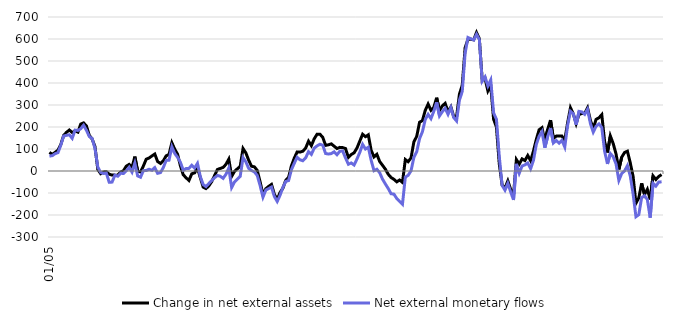
| Category | Change in net external assets | Net external monetary flows |
|---|---|---|
| 2005-01-01 | 84.602 | 67.742 |
| 2005-02-01 | 75.768 | 69.754 |
| 2005-03-01 | 84.565 | 78.479 |
| 2005-04-01 | 94.867 | 83.466 |
| 2005-05-01 | 120.796 | 117.752 |
| 2005-06-01 | 161.661 | 159.083 |
| 2005-07-01 | 175.894 | 162.193 |
| 2005-08-01 | 186.284 | 164.691 |
| 2005-09-01 | 175.003 | 148.417 |
| 2005-10-01 | 182.174 | 185.904 |
| 2005-11-01 | 176.606 | 184.289 |
| 2005-12-01 | 213.319 | 192.242 |
| 2006-01-01 | 218.733 | 207.939 |
| 2006-02-01 | 204.528 | 185.08 |
| 2006-03-01 | 162.228 | 156.78 |
| 2006-04-01 | 145.362 | 147.754 |
| 2006-05-01 | 111.135 | 102.606 |
| 2006-06-01 | 6.662 | 17.415 |
| 2006-07-01 | -12.166 | -6.296 |
| 2006-08-01 | -4.168 | -11.297 |
| 2006-09-01 | -3.265 | -9.8 |
| 2006-10-01 | -14.718 | -51.337 |
| 2006-11-01 | -18.699 | -50.437 |
| 2006-12-01 | -18.761 | -18.99 |
| 2007-01-01 | -18.794 | -23.779 |
| 2007-02-01 | -4.785 | -10.331 |
| 2007-03-01 | 1.322 | -11.333 |
| 2007-04-01 | 21.973 | 1.001 |
| 2007-05-01 | 29.944 | 17.265 |
| 2007-06-01 | 15.49 | -4.947 |
| 2007-07-01 | 65.435 | 35.61 |
| 2007-08-01 | -1.17 | -22.329 |
| 2007-09-01 | -4.492 | -28.356 |
| 2007-10-01 | 22.832 | 1.507 |
| 2007-11-01 | 53.698 | 2.105 |
| 2007-12-01 | 59.105 | 8.073 |
| 2008-01-01 | 68.422 | 3.251 |
| 2008-02-01 | 77.146 | 15.499 |
| 2008-03-01 | 43.111 | -10.56 |
| 2008-04-01 | 34.295 | -7.237 |
| 2008-05-01 | 46.499 | 15.561 |
| 2008-06-01 | 68.778 | 47.865 |
| 2008-07-01 | 75.541 | 49.158 |
| 2008-08-01 | 128.455 | 109.871 |
| 2008-09-01 | 99.379 | 80.045 |
| 2008-10-01 | 76.425 | 62.419 |
| 2008-11-01 | 23.697 | 39.814 |
| 2008-12-01 | -17.238 | 3.439 |
| 2009-01-01 | -30.81 | 11.219 |
| 2009-02-01 | -42.978 | 11.866 |
| 2009-03-01 | -12.659 | 26.365 |
| 2009-04-01 | -8.258 | 13.341 |
| 2009-05-01 | 13.629 | 34.681 |
| 2009-06-01 | -30.493 | -26.083 |
| 2009-07-01 | -73.165 | -61.587 |
| 2009-08-01 | -79.753 | -70.972 |
| 2009-09-01 | -67.73 | -56.797 |
| 2009-10-01 | -48.338 | -43.667 |
| 2009-11-01 | -20.878 | -30.458 |
| 2009-12-01 | 6.985 | -20.283 |
| 2010-01-01 | 11.571 | -23.811 |
| 2010-02-01 | 16.327 | -33.36 |
| 2010-03-01 | 30.202 | -14.966 |
| 2010-04-01 | 53.937 | 13.234 |
| 2010-05-01 | -24.51 | -75.025 |
| 2010-06-01 | -1.701 | -49.614 |
| 2010-07-01 | 9.895 | -36.86 |
| 2010-08-01 | 20.827 | -24.786 |
| 2010-09-01 | 102.244 | 61.041 |
| 2010-10-01 | 82.07 | 41.544 |
| 2010-11-01 | 48.49 | 11.583 |
| 2010-12-01 | 21.595 | 2.158 |
| 2011-01-01 | 18.876 | -4.419 |
| 2011-02-01 | 2.622 | -20.317 |
| 2011-03-01 | -49.304 | -66.419 |
| 2011-04-01 | -106.947 | -118.835 |
| 2011-05-01 | -80.67 | -86.757 |
| 2011-06-01 | -70.021 | -79.882 |
| 2011-07-01 | -60.962 | -72.934 |
| 2011-08-01 | -105.797 | -115.817 |
| 2011-09-01 | -129.501 | -138.462 |
| 2011-10-01 | -97.518 | -110.581 |
| 2011-11-01 | -78.197 | -74.537 |
| 2011-12-01 | -42.679 | -47.53 |
| 2012-01-01 | -29.112 | -43.465 |
| 2012-02-01 | 23.815 | 6.03 |
| 2012-03-01 | 58.542 | 35.278 |
| 2012-04-01 | 86.743 | 62.241 |
| 2012-05-01 | 85.993 | 50.944 |
| 2012-06-01 | 89.745 | 46.452 |
| 2012-07-01 | 104.245 | 59.744 |
| 2012-08-01 | 135.46 | 87.982 |
| 2012-09-01 | 115.213 | 75.569 |
| 2012-10-01 | 146.331 | 103.813 |
| 2012-11-01 | 167.246 | 114.222 |
| 2012-12-01 | 167.414 | 121.586 |
| 2013-01-01 | 152.876 | 116.925 |
| 2013-02-01 | 116.592 | 79.382 |
| 2013-03-01 | 119.069 | 77.228 |
| 2013-04-01 | 123.293 | 79.122 |
| 2013-05-01 | 112.653 | 87.399 |
| 2013-06-01 | 102.163 | 74.155 |
| 2013-07-01 | 107.454 | 90.001 |
| 2013-08-01 | 106.465 | 90.765 |
| 2013-09-01 | 101.981 | 59.142 |
| 2013-10-01 | 62.14 | 30.708 |
| 2013-11-01 | 74.663 | 36.578 |
| 2013-12-01 | 82.718 | 27.217 |
| 2014-01-01 | 103.873 | 53.978 |
| 2014-02-01 | 135.496 | 84.209 |
| 2014-03-01 | 167.072 | 121.102 |
| 2014-04-01 | 155.977 | 99.954 |
| 2014-05-01 | 164.473 | 107.861 |
| 2014-06-01 | 93.904 | 48.556 |
| 2014-07-01 | 64.113 | 1.586 |
| 2014-08-01 | 76.026 | 8.12 |
| 2014-09-01 | 42.969 | -8.053 |
| 2014-10-01 | 26.059 | -37.31 |
| 2014-11-01 | 8.059 | -59.117 |
| 2014-12-01 | -15.012 | -79.702 |
| 2015-01-01 | -29.624 | -103.37 |
| 2015-02-01 | -37.976 | -105.142 |
| 2015-03-01 | -49.245 | -125.194 |
| 2015-04-01 | -40.93 | -138.682 |
| 2015-05-01 | -52.006 | -151.08 |
| 2015-06-01 | 52.138 | -27.916 |
| 2015-07-01 | 42.19 | -19.548 |
| 2015-08-01 | 59.355 | 0.616 |
| 2015-09-01 | 132.123 | 61.715 |
| 2015-10-01 | 157.496 | 87.238 |
| 2015-11-01 | 221.645 | 147.184 |
| 2015-12-01 | 229.134 | 178.373 |
| 2016-01-01 | 275.633 | 233.851 |
| 2016-02-01 | 304.065 | 257.324 |
| 2016-03-01 | 275.872 | 238.001 |
| 2016-04-01 | 289.172 | 271.333 |
| 2016-05-01 | 333.132 | 312.25 |
| 2016-06-01 | 275.061 | 250.304 |
| 2016-07-01 | 296.226 | 269.814 |
| 2016-08-01 | 307.569 | 285.273 |
| 2016-09-01 | 269.195 | 257.496 |
| 2016-10-01 | 291.1 | 288.182 |
| 2016-11-01 | 247.737 | 242.725 |
| 2016-12-01 | 247.105 | 227.438 |
| 2017-01-01 | 348.817 | 322.292 |
| 2017-02-01 | 390.415 | 361.713 |
| 2017-03-01 | 560.135 | 535.461 |
| 2017-04-01 | 598.344 | 606.82 |
| 2017-05-01 | 598.977 | 600.858 |
| 2017-06-01 | 596.166 | 595.57 |
| 2017-07-01 | 629.416 | 621.638 |
| 2017-08-01 | 601.233 | 597.149 |
| 2017-09-01 | 412.849 | 407.873 |
| 2017-10-01 | 421.367 | 427.586 |
| 2017-11-01 | 363.582 | 386.555 |
| 2017-12-01 | 387.305 | 413.92 |
| 2018-01-01 | 235.716 | 264.296 |
| 2018-02-01 | 199.669 | 235.147 |
| 2018-03-01 | 31.722 | 65.964 |
| 2018-04-01 | -64.367 | -65.71 |
| 2018-05-01 | -77.832 | -87.233 |
| 2018-06-01 | -44.903 | -56.038 |
| 2018-07-01 | -84.093 | -95.425 |
| 2018-08-01 | -110.026 | -130.751 |
| 2018-09-01 | 51.922 | 32.057 |
| 2018-10-01 | 31.137 | -10.283 |
| 2018-11-01 | 55.059 | 22.546 |
| 2018-12-01 | 47.389 | 27.782 |
| 2019-01-01 | 70.498 | 36.35 |
| 2019-02-01 | 46.698 | 10.372 |
| 2019-03-01 | 90.65 | 48.02 |
| 2019-04-01 | 143.34 | 120.878 |
| 2019-05-01 | 187.409 | 158.262 |
| 2019-06-01 | 196.861 | 178.914 |
| 2019-07-01 | 135.278 | 105.694 |
| 2019-08-01 | 189.124 | 156.059 |
| 2019-09-01 | 231.431 | 195.16 |
| 2019-10-01 | 147.791 | 127.403 |
| 2019-11-01 | 158.529 | 138.611 |
| 2019-12-01 | 158.633 | 126.739 |
| 2020-01-01 | 158.719 | 139.749 |
| 2020-02-01 | 140.761 | 108.939 |
| 2020-03-01 | 219.177 | 207.615 |
| 2020-04-01 | 287.549 | 271.308 |
| 2020-05-01 | 259.467 | 260.148 |
| 2020-06-01 | 215.544 | 210.485 |
| 2020-07-01 | 256.966 | 271.15 |
| 2020-08-01 | 261.494 | 268.54 |
| 2020-09-01 | 262.382 | 257.592 |
| 2020-10-01 | 287.288 | 280.437 |
| 2020-11-01 | 230.463 | 215.749 |
| 2020-12-01 | 193.347 | 176.615 |
| 2021-01-01 | 234.762 | 203.285 |
| 2021-02-01 | 241.866 | 214.219 |
| 2021-03-01 | 256.068 | 197.809 |
| 2021-04-01 | 133.391 | 89.394 |
| 2021-05-01 | 84.025 | 32.133 |
| 2021-06-01 | 159.539 | 79.489 |
| 2021-07-01 | 124.997 | 64.783 |
| 2021-08-01 | 77.773 | 32.653 |
| 2021-09-01 | 7.261 | -42.703 |
| 2021-10-01 | 63.097 | -11.354 |
| 2021-11-01 | 83.833 | 0.38 |
| 2021-12-01 | 90.092 | 24.262 |
| 2022-01-01 | 37.183 | -22.688 |
| 2022-02-01 | -24.697 | -104.484 |
| 2022-03-01 | -146.248 | -207.922 |
| 2022-04-01 | -122.119 | -198.503 |
| 2022-05-01 | -56.107 | -120.854 |
| 2022-06-01 | -107.367 | -112.218 |
| 2022-07-01 | -83.239 | -129.638 |
| 2022-08-01 | -129.191 | -212.216 |
| 2022-09-01 | -22.199 | -55.96 |
| 2022-10-01 | -38.653 | -68.581 |
| 2022-11-01 | -24.918 | -50.343 |
| 2022-12-01 | -16.316 | -49.175 |